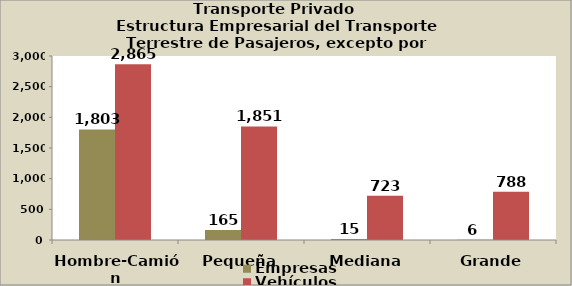
| Category | Empresas | Vehículos |
|---|---|---|
| Hombre-Camión | 1803 | 2865 |
| Pequeña | 165 | 1851 |
| Mediana | 15 | 723 |
| Grande | 6 | 788 |